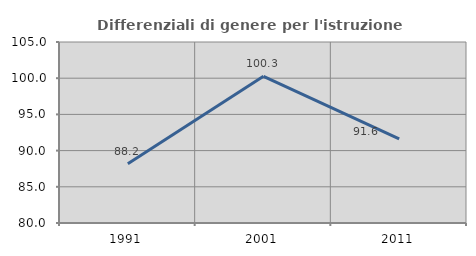
| Category | Differenziali di genere per l'istruzione superiore |
|---|---|
| 1991.0 | 88.195 |
| 2001.0 | 100.266 |
| 2011.0 | 91.605 |